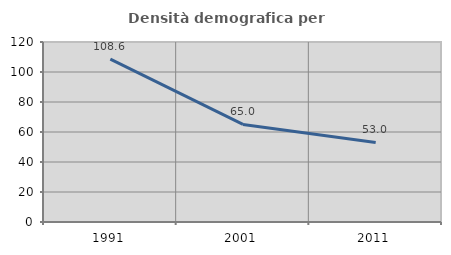
| Category | Densità demografica |
|---|---|
| 1991.0 | 108.634 |
| 2001.0 | 65.023 |
| 2011.0 | 53.028 |